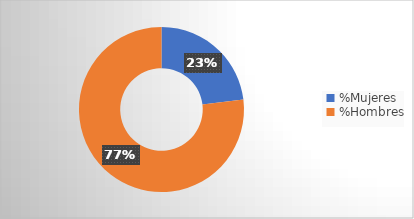
| Category | Integrantes Consejo de Administracion |
|---|---|
| %Mujeres | 0.231 |
| %Hombres | 0.769 |